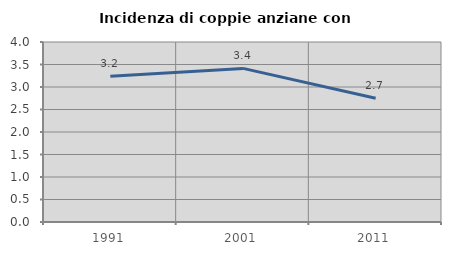
| Category | Incidenza di coppie anziane con figli |
|---|---|
| 1991.0 | 3.237 |
| 2001.0 | 3.413 |
| 2011.0 | 2.748 |